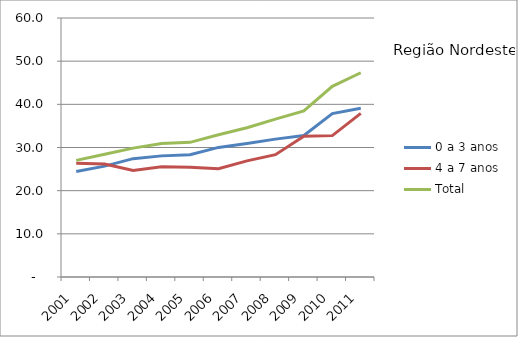
| Category | 0 a 3 anos | 4 a 7 anos | Total |
|---|---|---|---|
| 2001.0 | 24.45 | 26.35 | 27.01 |
| 2002.0 | 25.68 | 26.17 | 28.43 |
| 2003.0 | 27.42 | 24.66 | 29.86 |
| 2004.0 | 28.06 | 25.54 | 30.93 |
| 2005.0 | 28.32 | 25.44 | 31.19 |
| 2006.0 | 30.02 | 25.08 | 32.95 |
| 2007.0 | 30.95 | 26.91 | 34.57 |
| 2008.0 | 31.94 | 28.34 | 36.57 |
| 2009.0 | 32.78 | 32.6 | 38.49 |
| 2010.0 | 37.86 | 32.75 | 44.16 |
| 2011.0 | 39.08 | 37.9 | 47.32 |